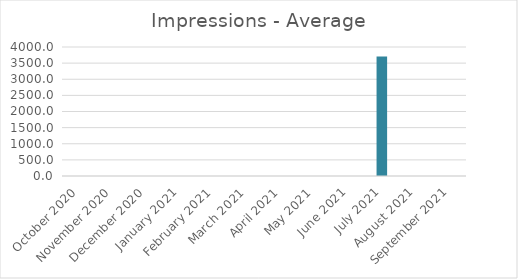
| Category | Average |
|---|---|
| October 2020 | 0 |
| November 2020 | 0 |
| December 2020 | 0 |
| January 2021 | 0 |
| February 2021 | 0 |
| March 2021 | 0 |
| April 2021 | 0 |
| May 2021 | 0 |
| June 2021 | 0 |
| July 2021 | 3701.558 |
| August 2021 | 0 |
| September 2021 | 0 |